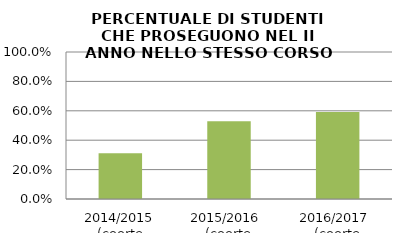
| Category | 2014/2015 (coorte 2013/14) 2015/2016  (coorte 2014/15) 2016/2017  (coorte 2015/16) |
|---|---|
| 2014/2015 (coorte 2013/14) | 0.311 |
| 2015/2016  (coorte 2014/15) | 0.529 |
| 2016/2017  (coorte 2015/16) | 0.593 |